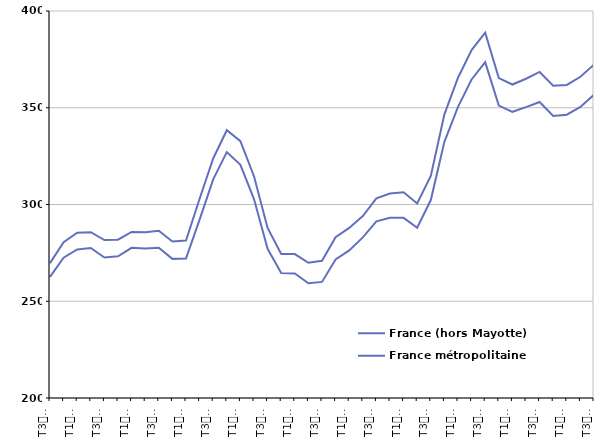
| Category | France (hors Mayotte) | France métropolitaine |
|---|---|---|
| T3
2013 | 269.7 | 262.6 |
| T4
2013 | 280.5 | 272.5 |
| T1
2014 | 285.4 | 276.8 |
| T2
2014 | 285.7 | 277.5 |
| T3
2014 | 281.6 | 272.6 |
| T4
2014 | 281.8 | 273.2 |
| T1
2015 | 285.8 | 277.6 |
| T2
2015 | 285.7 | 277.3 |
| T3
2015 | 286.4 | 277.6 |
| T4
2015 | 280.9 | 271.9 |
| T1
2016 | 281.4 | 272.1 |
| T2
2016 | 303 | 292.2 |
| T3
2016 | 323.8 | 313 |
| T4
2016 | 338.4 | 327.1 |
| T1
2017 | 332.7 | 320.5 |
| T2
2017 | 314.6 | 302.8 |
| T3
2017 | 287.9 | 277.1 |
| T4
2017 | 274.4 | 264.6 |
| T1
2018 | 274.4 | 264.4 |
| T2
2018 | 269.9 | 259.3 |
| T3
2018 | 270.9 | 260 |
| T4
2018 | 283.1 | 271.6 |
| T1
2019 | 287.9 | 276.3 |
| T2
2019 | 294 | 283 |
| T3
2019 | 303.2 | 291.3 |
| T4
2019 | 305.7 | 293.1 |
| T1
2020 | 306.3 | 293.1 |
| T2
2020 | 300.5 | 288 |
| T3
2020 | 314.8 | 302.3 |
| T4
2020 | 346.6 | 332.4 |
| T1
2021 | 365.5 | 350.5 |
| T2
2021 | 379.8 | 364.6 |
| T3
2021 | 388.8 | 373.6 |
| T4
2021 | 365.3 | 351.1 |
| T1
2022 | 362 | 347.9 |
| T2
2022 | 365 | 350.3 |
| T3
2022 | 368.5 | 353 |
| T4
2022 | 361.4 | 345.8 |
| T1
2023 | 361.8 | 346.4 |
| T2
2023 | 366 | 350.4 |
| T3
2023 | 372.3 | 356.7 |